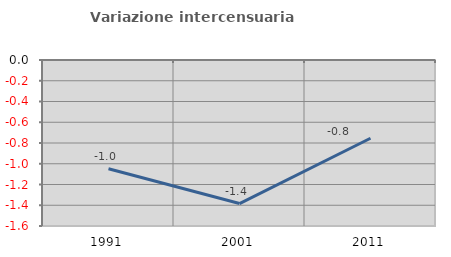
| Category | Variazione intercensuaria annua |
|---|---|
| 1991.0 | -1.048 |
| 2001.0 | -1.384 |
| 2011.0 | -0.754 |